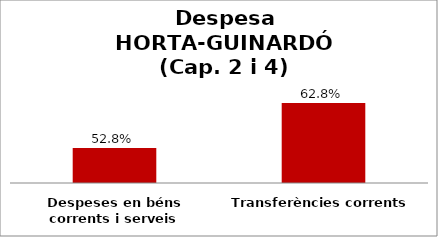
| Category | Series 0 |
|---|---|
| Despeses en béns corrents i serveis | 0.528 |
| Transferències corrents | 0.628 |